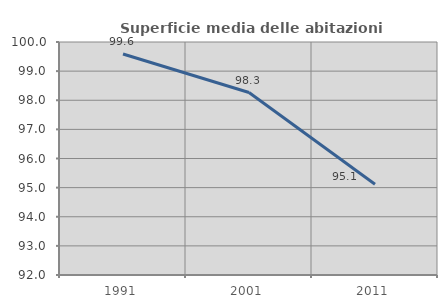
| Category | Superficie media delle abitazioni occupate |
|---|---|
| 1991.0 | 99.586 |
| 2001.0 | 98.264 |
| 2011.0 | 95.115 |